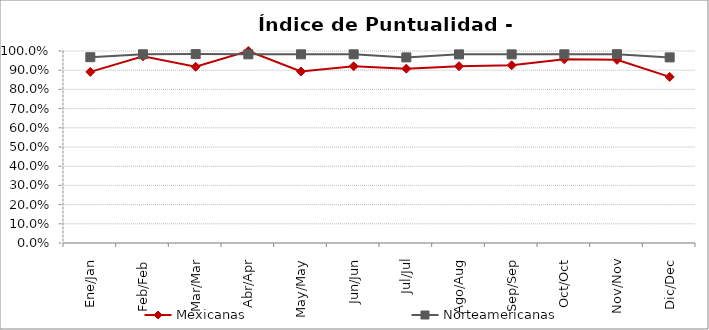
| Category | Mexicanas | Norteamericanas |
|---|---|---|
| Ene/Jan | 0.891 | 0.968 |
| Feb/Feb | 0.973 | 0.983 |
| Mar/Mar | 0.918 | 0.984 |
| Abr/Apr | 1 | 0.983 |
| May/May | 0.893 | 0.983 |
| Jun/Jun | 0.92 | 0.983 |
| Jul/Jul | 0.908 | 0.967 |
| Ago/Aug | 0.921 | 0.982 |
| Sep/Sep | 0.925 | 0.982 |
| Oct/Oct | 0.957 | 0.983 |
| Nov/Nov | 0.954 | 0.983 |
| Dic/Dec | 0.865 | 0.967 |